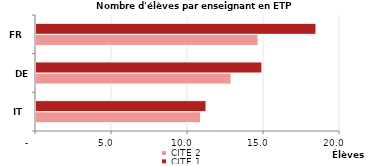
| Category | CITE 2 | CITE 1 |
|---|---|---|
| IT | 10.83 | 11.187 |
| DE | 12.834 | 14.863 |
| FR | 14.609 | 18.42 |